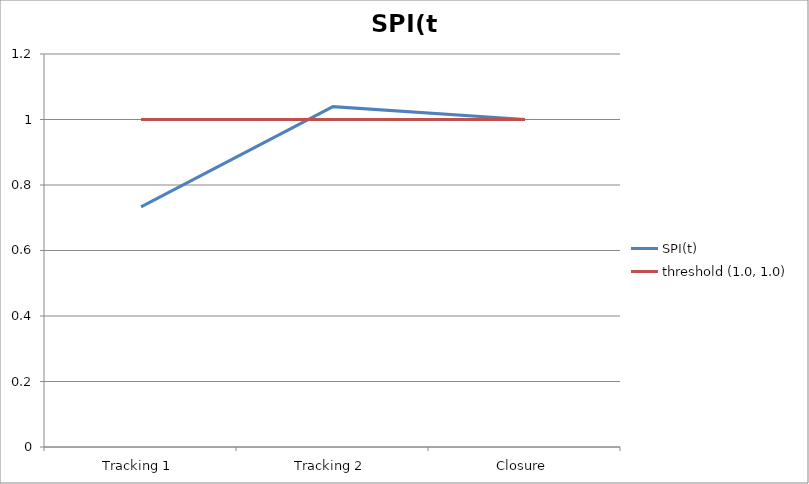
| Category | SPI(t) | threshold (1.0, 1.0) |
|---|---|---|
| Tracking 1 | 0.733 | 1 |
| Tracking 2 | 1.039 | 1 |
| Closure | 1 | 1 |